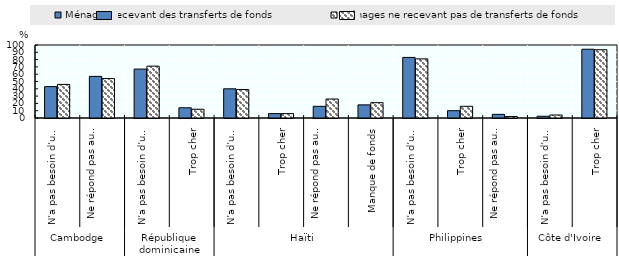
| Category | Ménages recevant des transferts de fonds | Ménages ne recevant pas de transferts de fonds |
|---|---|---|
| 0 | 43 | 46 |
| 1 | 57 | 54 |
| 2 | 67 | 71 |
| 3 | 14 | 12 |
| 4 | 40 | 39 |
| 5 | 6 | 6 |
| 6 | 16 | 26 |
| 7 | 18 | 21 |
| 8 | 83 | 81 |
| 9 | 10 | 16 |
| 10 | 5 | 2 |
| 11 | 2.4 | 4.1 |
| 12 | 94.2 | 93.5 |